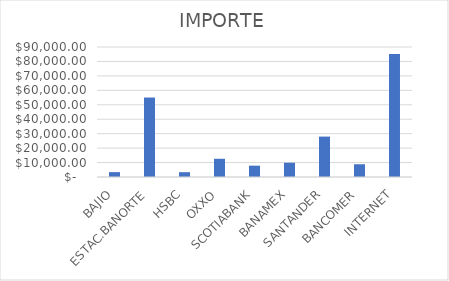
| Category | IMPORTE |
|---|---|
| BAJIO | 3365.31 |
| ESTAC.BANORTE | 55014.5 |
| HSBC | 3335.78 |
| OXXO | 12618.91 |
| SCOTIABANK | 7846.97 |
| BANAMEX | 9876.88 |
| SANTANDER | 27972.53 |
| BANCOMER | 8820.87 |
| INTERNET | 85131.42 |